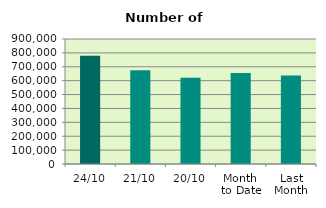
| Category | Series 0 |
|---|---|
| 24/10 | 780196 |
| 21/10 | 675620 |
| 20/10 | 621422 |
| Month 
to Date | 655785.5 |
| Last
Month | 637968.273 |